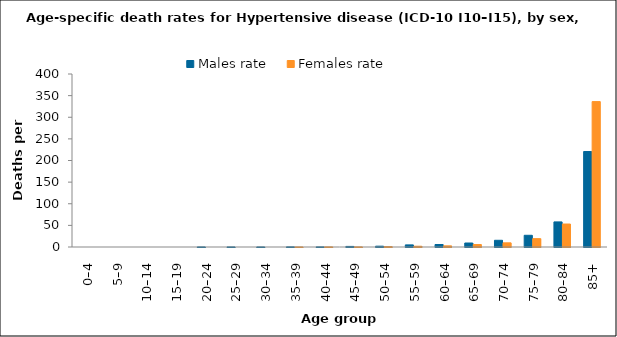
| Category | Males rate | Females rate |
|---|---|---|
| 0–4 | 0 | 0 |
| 5–9 | 0 | 0 |
| 10–14 | 0 | 0 |
| 15–19 | 0 | 0 |
| 20–24 | 0.119 | 0 |
| 25–29 | 0.109 | 0 |
| 30–34 | 0.106 | 0 |
| 35–39 | 0.323 | 0.106 |
| 40–44 | 0.245 | 0.238 |
| 45–49 | 1.346 | 0.24 |
| 50–54 | 1.889 | 0.979 |
| 55–59 | 4.852 | 1.777 |
| 60–64 | 5.765 | 2.653 |
| 65–69 | 9.23 | 5.735 |
| 70–74 | 15.504 | 9.627 |
| 75–79 | 27.073 | 19.315 |
| 80–84 | 58.009 | 53.14 |
| 85+ | 220.767 | 336.157 |